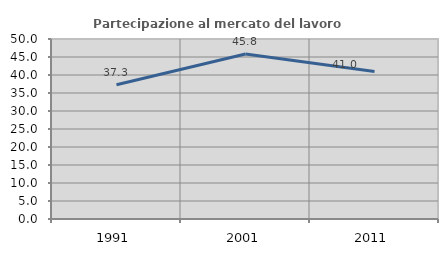
| Category | Partecipazione al mercato del lavoro  femminile |
|---|---|
| 1991.0 | 37.288 |
| 2001.0 | 45.833 |
| 2011.0 | 41 |